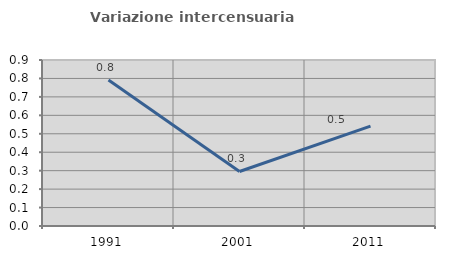
| Category | Variazione intercensuaria annua |
|---|---|
| 1991.0 | 0.792 |
| 2001.0 | 0.296 |
| 2011.0 | 0.541 |